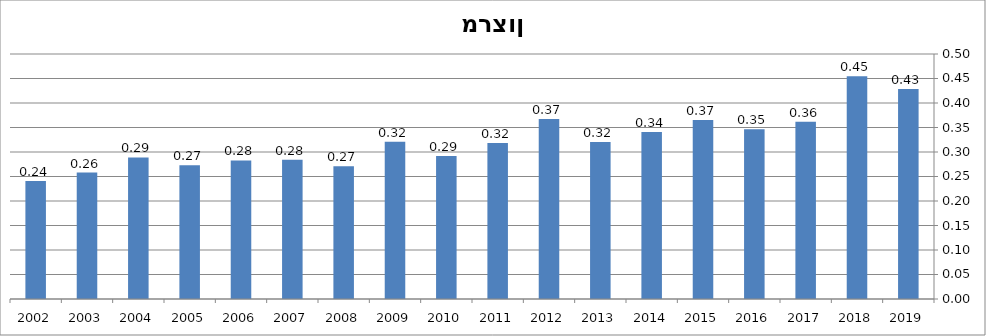
| Category | Series 0 |
|---|---|
| 2019.0 | 0.429 |
| 2018.0 | 0.455 |
| 2017.0 | 0.362 |
| 2016.0 | 0.346 |
| 2015.0 | 0.366 |
| 2014.0 | 0.341 |
| 2013.0 | 0.321 |
| 2012.0 | 0.368 |
| 2011.0 | 0.318 |
| 2010.0 | 0.292 |
| 2009.0 | 0.321 |
| 2008.0 | 0.271 |
| 2007.0 | 0.284 |
| 2006.0 | 0.283 |
| 2005.0 | 0.273 |
| 2004.0 | 0.289 |
| 2003.0 | 0.258 |
| 2002.0 | 0.241 |